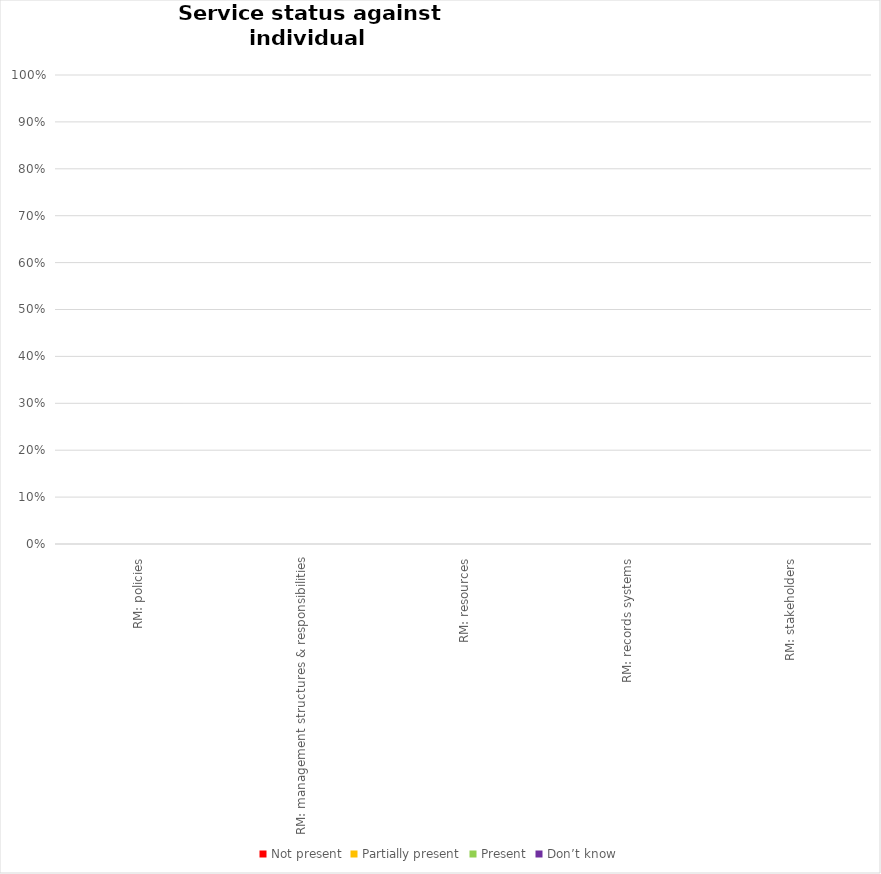
| Category | Not present | Partially present | Present | Don’t know |
|---|---|---|---|---|
| RM: policies | 0 | 0 | 0 | 0 |
| RM: management structures & responsibilities | 0 | 0 | 0 | 0 |
| RM: resources | 0 | 0 | 0 | 0 |
| RM: records systems | 0 | 0 | 0 | 0 |
| RM: stakeholders | 0 | 0 | 0 | 0 |